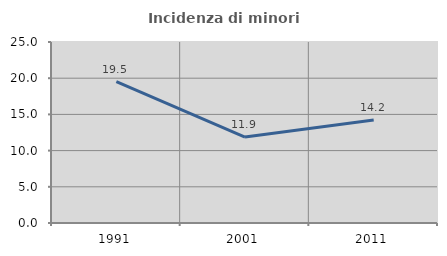
| Category | Incidenza di minori stranieri |
|---|---|
| 1991.0 | 19.512 |
| 2001.0 | 11.868 |
| 2011.0 | 14.218 |